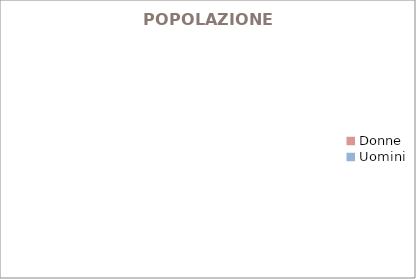
| Category | POPOLAZIONE -  |
|---|---|
| Donne | 0 |
| Uomini | 0 |